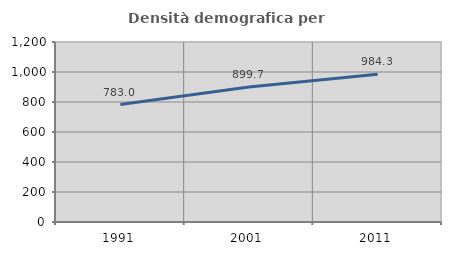
| Category | Densità demografica |
|---|---|
| 1991.0 | 782.967 |
| 2001.0 | 899.67 |
| 2011.0 | 984.262 |